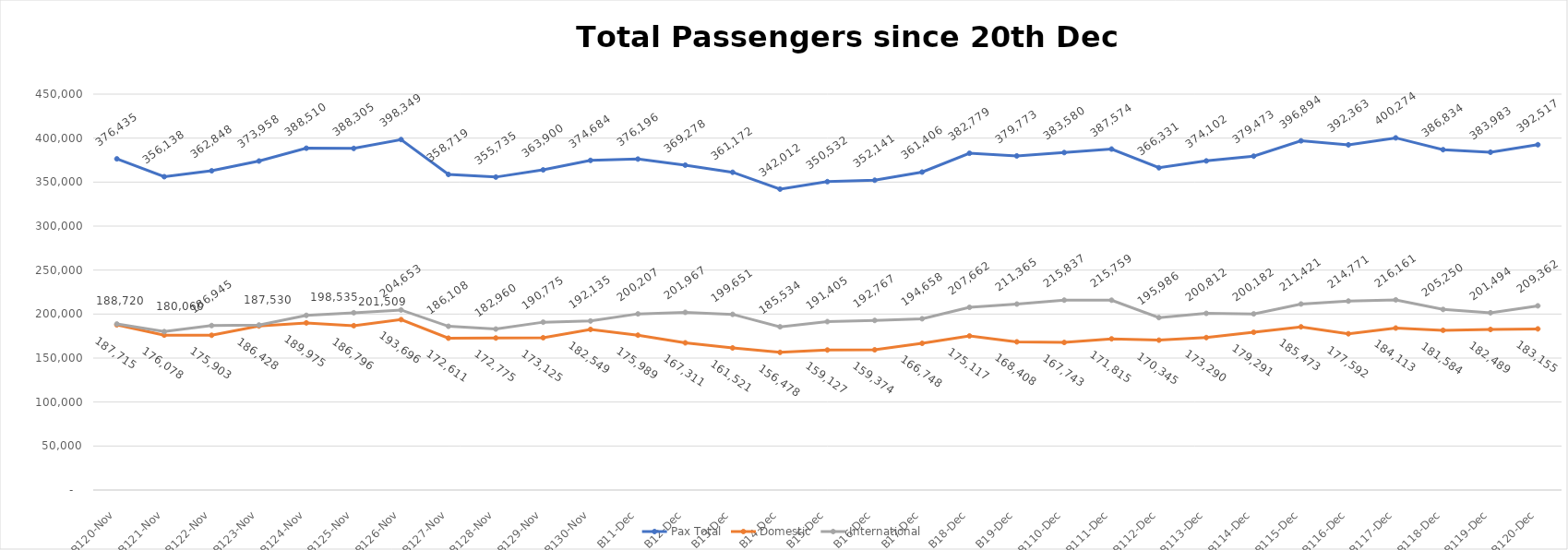
| Category | Pax Total | Domestic | International |
|---|---|---|---|
| 2023-11-20 | 376435 | 187715 | 188720 |
| 2023-11-21 | 356138 | 176078 | 180060 |
| 2023-11-22 | 362848 | 175903 | 186945 |
| 2023-11-23 | 373958 | 186428 | 187530 |
| 2023-11-24 | 388510 | 189975 | 198535 |
| 2023-11-25 | 388305 | 186796 | 201509 |
| 2023-11-26 | 398349 | 193696 | 204653 |
| 2023-11-27 | 358719 | 172611 | 186108 |
| 2023-11-28 | 355735 | 172775 | 182960 |
| 2023-11-29 | 363900 | 173125 | 190775 |
| 2023-11-30 | 374684 | 182549 | 192135 |
| 2023-12-01 | 376196 | 175989 | 200207 |
| 2023-12-02 | 369278 | 167311 | 201967 |
| 2023-12-03 | 361172 | 161521 | 199651 |
| 2023-12-04 | 342012 | 156478 | 185534 |
| 2023-12-05 | 350532 | 159127 | 191405 |
| 2023-12-06 | 352141 | 159374 | 192767 |
| 2023-12-07 | 361406 | 166748 | 194658 |
| 2023-12-08 | 382779 | 175117 | 207662 |
| 2023-12-09 | 379773 | 168408 | 211365 |
| 2023-12-10 | 383580 | 167743 | 215837 |
| 2023-12-11 | 387574 | 171815 | 215759 |
| 2023-12-12 | 366331 | 170345 | 195986 |
| 2023-12-13 | 374102 | 173290 | 200812 |
| 2023-12-14 | 379473 | 179291 | 200182 |
| 2023-12-15 | 396894 | 185473 | 211421 |
| 2023-12-16 | 392363 | 177592 | 214771 |
| 2023-12-17 | 400274 | 184113 | 216161 |
| 2023-12-18 | 386834 | 181584 | 205250 |
| 2023-12-19 | 383983 | 182489 | 201494 |
| 2023-12-20 | 392517 | 183155 | 209362 |